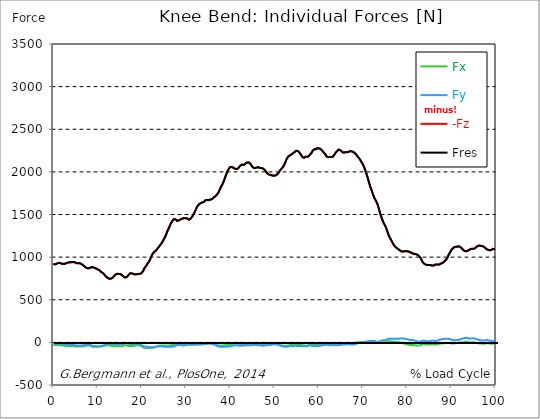
| Category |  Fx |  Fy |  -Fz |  Fres |
|---|---|---|---|---|
| 0.0 | -29.6 | -11.51 | 920.39 | 921.09 |
| 0.167348456675344 | -29.86 | -11.63 | 915.72 | 916.42 |
| 0.334696913350688 | -30.33 | -12.52 | 914.68 | 915.38 |
| 0.5020453700260321 | -30.87 | -13.44 | 916.3 | 917.03 |
| 0.669393826701376 | -31.92 | -15.22 | 919.17 | 920 |
| 0.83674228337672 | -32.69 | -15.88 | 925.15 | 926.02 |
| 1.0040907400520642 | -32.63 | -15.28 | 928.49 | 929.38 |
| 1.1621420602454444 | -33.1 | -15.46 | 931.57 | 932.5 |
| 1.3294905169207885 | -34.34 | -17.1 | 933.19 | 934.24 |
| 1.4968389735961325 | -33.93 | -16.55 | 931.96 | 932.98 |
| 1.6641874302714765 | -33.9 | -16.96 | 927.29 | 928.27 |
| 1.8315358869468206 | -35.71 | -19.66 | 921.16 | 922.18 |
| 1.9988843436221646 | -36.73 | -21.49 | 919.78 | 920.84 |
| 2.1662328002975086 | -37.03 | -21.67 | 919.46 | 920.54 |
| 2.333581256972853 | -37.73 | -22.18 | 920.14 | 921.26 |
| 2.5009297136481967 | -38.57 | -22.88 | 921.05 | 922.22 |
| 2.6682781703235405 | -39.08 | -23.29 | 922.71 | 923.9 |
| 2.8356266269988843 | -40.06 | -24.19 | 924.94 | 926.21 |
| 3.002975083674229 | -41.01 | -25 | 929.22 | 930.53 |
| 3.1703235403495724 | -41.32 | -25.15 | 932.81 | 934.14 |
| 3.337671997024917 | -41.63 | -25.3 | 936.4 | 937.75 |
| 3.4957233172182973 | -42.59 | -26.61 | 938.2 | 939.61 |
| 3.663071773893641 | -43.16 | -27.22 | 938.02 | 939.47 |
| 3.8304202305689854 | -43.08 | -26.8 | 937.91 | 939.34 |
| 3.997768687244329 | -43.61 | -27.53 | 938.73 | 940.22 |
| 4.165117143919673 | -44.58 | -28.84 | 940.03 | 941.62 |
| 4.332465600595017 | -45.62 | -30.15 | 941.02 | 942.73 |
| 4.499814057270361 | -46.16 | -31.24 | 941.23 | 943.02 |
| 4.667162513945706 | -46.46 | -32.11 | 940.82 | 942.66 |
| 4.834510970621049 | -46.57 | -32.76 | 938.33 | 940.16 |
| 5.001859427296393 | -47.49 | -34.1 | 934.45 | 936.35 |
| 5.169207883971737 | -48.42 | -35.43 | 930.56 | 932.54 |
| 5.336556340647081 | -49.16 | -36.52 | 927.31 | 929.36 |
| 5.503904797322425 | -48.64 | -36.14 | 927.49 | 929.49 |
| 5.671253253997769 | -48 | -35.77 | 927.72 | 929.68 |
| 5.82930457419115 | -47.94 | -35.78 | 928.34 | 930.28 |
| 5.996653030866494 | -48.32 | -36.75 | 926.7 | 928.7 |
| 6.164001487541838 | -48.49 | -37.44 | 924.11 | 926.15 |
| 6.331349944217181 | -48.01 | -37.28 | 918.09 | 920.11 |
| 6.498698400892526 | -46.69 | -34.7 | 913.93 | 915.78 |
| 6.66604685756787 | -45.64 | -33.03 | 906.58 | 908.33 |
| 6.833395314243213 | -44.74 | -31.99 | 898.5 | 900.18 |
| 7.000743770918558 | -44.34 | -32.43 | 890.57 | 892.28 |
| 7.168092227593902 | -42.76 | -31.74 | 883.73 | 885.35 |
| 7.335440684269246 | -40.46 | -30.37 | 877.53 | 879.02 |
| 7.50278914094459 | -38.16 | -28.99 | 871.33 | 872.69 |
| 7.6701375976199335 | -35.48 | -27.53 | 868.53 | 869.76 |
| 7.837486054295278 | -34.72 | -26.75 | 869.11 | 870.34 |
| 7.995537374488658 | -35.27 | -28.09 | 869.01 | 870.35 |
| 8.162885831164003 | -36.16 | -28.33 | 870.44 | 871.87 |
| 8.330234287839346 | -37.38 | -28.66 | 872.74 | 874.26 |
| 8.49758274451469 | -42.42 | -33.16 | 879.26 | 881.08 |
| 8.664931201190035 | -47.8 | -37.67 | 883.02 | 885.16 |
| 8.832279657865378 | -50.67 | -39.99 | 881.62 | 884.02 |
| 8.999628114540721 | -51.43 | -40.34 | 878.9 | 881.38 |
| 9.166976571216066 | -52.51 | -41.39 | 875.75 | 878.35 |
| 9.334325027891412 | -53.77 | -43.29 | 872.15 | 874.94 |
| 9.501673484566755 | -52.86 | -43.46 | 868 | 870.75 |
| 9.669021941242098 | -52.33 | -44.81 | 865.1 | 867.89 |
| 9.836370397917442 | -52.55 | -46.55 | 861.79 | 864.71 |
| 10.003718854592787 | -51.9 | -46.41 | 854.38 | 857.29 |
| 10.17106731126813 | -50.65 | -45.52 | 850.39 | 853.19 |
| 10.329118631461512 | -49.57 | -44.95 | 848.11 | 850.82 |
| 10.496467088136853 | -49.31 | -44.72 | 840.46 | 843.18 |
| 10.663815544812199 | -48.68 | -43.2 | 829.64 | 832.28 |
| 10.831164001487544 | -48.29 | -41.49 | 819.55 | 822.11 |
| 10.998512458162887 | -47.46 | -40.37 | 817.77 | 820.23 |
| 11.16586091483823 | -45.4 | -38.01 | 813.75 | 816 |
| 11.333209371513574 | -42.5 | -34.6 | 806.28 | 808.26 |
| 11.50055782818892 | -39.16 | -30.52 | 795.48 | 797.17 |
| 11.667906284864264 | -37.33 | -27.38 | 784.45 | 785.99 |
| 11.835254741539607 | -36.13 | -24.94 | 774.51 | 775.93 |
| 12.00260319821495 | -35.88 | -23.2 | 766.22 | 767.56 |
| 12.169951654890292 | -35.64 | -21.07 | 760.16 | 761.41 |
| 12.337300111565641 | -34.73 | -18.58 | 755.38 | 756.53 |
| 12.504648568240984 | -34.28 | -16.94 | 750.52 | 751.62 |
| 12.662699888434362 | -35.39 | -16.76 | 744.77 | 745.9 |
| 12.830048345109708 | -37.53 | -17.11 | 743.9 | 745.11 |
| 12.997396801785053 | -40.3 | -18.28 | 746.57 | 747.94 |
| 13.164745258460396 | -42.74 | -18.81 | 749.53 | 751.01 |
| 13.33209371513574 | -42.55 | -18.85 | 754.73 | 756.17 |
| 13.499442171811083 | -43.87 | -19.52 | 762.56 | 764.08 |
| 13.666790628486426 | -45.66 | -21.03 | 773.2 | 774.84 |
| 13.834139085161771 | -46.95 | -22.02 | 784.34 | 786.06 |
| 14.001487541837117 | -46.43 | -22.55 | 792.73 | 794.42 |
| 14.16883599851246 | -45.58 | -22.04 | 798.1 | 799.71 |
| 14.336184455187803 | -44.4 | -21.54 | 801.89 | 803.41 |
| 14.503532911863147 | -44.03 | -21.27 | 803.74 | 805.24 |
| 14.670881368538492 | -43.7 | -20.94 | 803.59 | 805.06 |
| 14.828932688731873 | -43.55 | -20.84 | 801.99 | 803.46 |
| 14.996281145407215 | -44.41 | -21.9 | 800.26 | 801.81 |
| 15.163629602082558 | -45.67 | -22.87 | 797.91 | 799.58 |
| 15.330978058757903 | -46.89 | -23.71 | 795.24 | 797.03 |
| 15.498326515433247 | -46.03 | -22.47 | 788.77 | 790.47 |
| 15.665674972108594 | -43.74 | -20.25 | 780.63 | 782.15 |
| 15.833023428783937 | -40.45 | -17.39 | 771.09 | 772.36 |
| 16.00037188545928 | -36.11 | -13.85 | 765.36 | 766.46 |
| 16.167720342134626 | -32.44 | -10.69 | 760.87 | 761.85 |
| 16.335068798809967 | -33.49 | -10.38 | 760.96 | 762.07 |
| 16.502417255485312 | -35.17 | -10.41 | 762.32 | 763.57 |
| 16.669765712160658 | -38.21 | -12.4 | 768.3 | 769.74 |
| 16.837114168836 | -41.49 | -15.13 | 778.02 | 779.74 |
| 17.004462625511344 | -43.08 | -16.89 | 789.11 | 790.98 |
| 17.16251394570472 | -43.84 | -18.07 | 800.45 | 802.39 |
| 17.32986240238007 | -43.35 | -18.12 | 807.63 | 809.47 |
| 17.497210859055414 | -42.3 | -17.57 | 810.36 | 811.99 |
| 17.664559315730756 | -42.6 | -18.29 | 810.24 | 811.79 |
| 17.8319077724061 | -43.16 | -19.32 | 808.1 | 809.63 |
| 17.999256229081443 | -43.04 | -19.41 | 803.05 | 804.56 |
| 18.166604685756788 | -41.94 | -18.9 | 798.83 | 800.3 |
| 18.333953142432133 | -40.8 | -18.94 | 797.31 | 798.71 |
| 18.501301599107478 | -37.9 | -17.93 | 796.75 | 798.05 |
| 18.668650055782823 | -35.26 | -16.97 | 796.23 | 797.5 |
| 18.835998512458165 | -32.87 | -16.13 | 796.87 | 798.12 |
| 19.00334696913351 | -33.11 | -17.08 | 800.18 | 801.42 |
| 19.170695425808855 | -34.25 | -18.61 | 802.83 | 804.07 |
| 19.338043882484197 | -35.45 | -20.51 | 802.36 | 803.65 |
| 19.496095202677576 | -36.98 | -23.09 | 802.03 | 803.39 |
| 19.66344365935292 | -39.53 | -25.41 | 803.21 | 804.72 |
| 19.830792116028263 | -43.31 | -29.27 | 808.82 | 810.62 |
| 19.998140572703612 | -48.04 | -33.35 | 815.28 | 817.44 |
| 20.165489029378953 | -52.74 | -37.77 | 825.2 | 827.82 |
| 20.3328374860543 | -58.09 | -42.98 | 838.89 | 842.08 |
| 20.500185942729644 | -63.24 | -48.02 | 856.44 | 860.24 |
| 20.667534399404985 | -65.29 | -50.26 | 873.62 | 877.64 |
| 20.83488285608033 | -64.54 | -49.6 | 884.16 | 888.04 |
| 21.002231312755672 | -65.47 | -51.34 | 896.21 | 900.21 |
| 21.16957976943102 | -66.18 | -52.79 | 909.7 | 913.79 |
| 21.336928226106362 | -65.36 | -52.5 | 923.86 | 927.81 |
| 21.504276682781704 | -64.09 | -51.93 | 934.5 | 938.28 |
| 21.67162513945705 | -64.22 | -53.04 | 947.59 | 951.4 |
| 21.82967645965043 | -64.83 | -55 | 965.49 | 969.39 |
| 21.997024916325774 | -65.22 | -57.06 | 986.82 | 990.78 |
| 22.16437337300112 | -64.61 | -58.27 | 1007.57 | 1011.47 |
| 22.33172182967646 | -62.94 | -58.69 | 1024.87 | 1028.62 |
| 22.499070286351806 | -61.05 | -58.86 | 1041.22 | 1044.81 |
| 22.666418743027148 | -58.55 | -57.57 | 1052.1 | 1055.45 |
| 22.833767199702496 | -55.34 | -56.13 | 1060.36 | 1063.39 |
| 23.00111565637784 | -52.32 | -53.55 | 1065.95 | 1068.66 |
| 23.168464113053183 | -49.63 | -51.13 | 1072.96 | 1075.4 |
| 23.335812569728528 | -47.42 | -49.63 | 1084.54 | 1086.79 |
| 23.50316102640387 | -44.89 | -48.33 | 1096.78 | 1098.84 |
| 23.670509483079215 | -42.32 | -47.55 | 1107.11 | 1109.01 |
| 23.83785793975456 | -40.55 | -47.1 | 1118.29 | 1120.11 |
| 23.995909259947936 | -37.89 | -45.49 | 1130.19 | 1131.89 |
| 24.163257716623285 | -36 | -44.75 | 1141.25 | 1142.86 |
| 24.330606173298627 | -35.78 | -45.83 | 1152.1 | 1153.73 |
| 24.49795462997397 | -36.03 | -47.31 | 1165.18 | 1166.88 |
| 24.665303086649313 | -36.29 | -48.79 | 1178.36 | 1180.13 |
| 24.83265154332466 | -36.76 | -50.52 | 1194.33 | 1196.18 |
| 25.0 | -36.59 | -51.01 | 1209.28 | 1211.15 |
| 25.167348456675345 | -36.57 | -50.94 | 1225.3 | 1227.16 |
| 25.334696913350694 | -36.8 | -49.89 | 1243.2 | 1245.02 |
| 25.502045370026035 | -37.88 | -50.1 | 1264.51 | 1266.31 |
| 25.669393826701377 | -38.68 | -50.99 | 1287.17 | 1288.95 |
| 25.836742283376722 | -38.24 | -50.99 | 1309.2 | 1310.9 |
| 26.004090740052067 | -37.12 | -50.98 | 1326.26 | 1327.97 |
| 26.17143919672741 | -35.77 | -51.31 | 1344.73 | 1346.43 |
| 26.329490516920792 | -35.44 | -52.6 | 1367.64 | 1369.36 |
| 26.49683897359613 | -34.44 | -53.25 | 1387.86 | 1389.56 |
| 26.66418743027148 | -32.24 | -52.45 | 1402.54 | 1404.14 |
| 26.831535886946828 | -30.42 | -51.37 | 1417.19 | 1418.69 |
| 26.998884343622166 | -28.6 | -50.29 | 1431.84 | 1433.25 |
| 27.166232800297514 | -26.65 | -49.77 | 1441.96 | 1443.32 |
| 27.333581256972852 | -24.14 | -47.78 | 1446.44 | 1447.69 |
| 27.5009297136482 | -21.81 | -43.4 | 1446.8 | 1447.92 |
| 27.668278170323543 | -20.57 | -38.21 | 1441.13 | 1442.15 |
| 27.835626626998888 | -20.11 | -34.62 | 1431.57 | 1432.57 |
| 28.002975083674233 | -20.04 | -31.72 | 1422.88 | 1423.86 |
| 28.170323540349575 | -21.09 | -31.96 | 1426.31 | 1427.3 |
| 28.33767199702492 | -21.3 | -30.96 | 1430.09 | 1431.08 |
| 28.50502045370026 | -22.06 | -30.56 | 1434.39 | 1435.39 |
| 28.663071773893645 | -23.07 | -30.52 | 1438.99 | 1440 |
| 28.830420230568986 | -23.66 | -30.86 | 1443.13 | 1444.18 |
| 28.99776868724433 | -25.26 | -33.04 | 1447.11 | 1448.23 |
| 29.165117143919673 | -27.64 | -35.78 | 1451.36 | 1452.54 |
| 29.33246560059502 | -29.17 | -37.18 | 1455.55 | 1456.78 |
| 29.499814057270367 | -29.34 | -36.35 | 1455.73 | 1456.95 |
| 29.66716251394571 | -29.39 | -34.62 | 1456.59 | 1457.82 |
| 29.834510970621054 | -29.43 | -32.85 | 1457.53 | 1458.77 |
| 30.00185942729639 | -28.13 | -29.37 | 1455.18 | 1456.4 |
| 30.169207883971744 | -26.94 | -25.33 | 1452.05 | 1453.26 |
| 30.33655634064708 | -26.61 | -22.98 | 1450.82 | 1452.04 |
| 30.50390479732243 | -26.49 | -22.01 | 1440.96 | 1442.19 |
| 30.671253253997772 | -26.54 | -21.95 | 1438.46 | 1439.68 |
| 30.829304574191156 | -27.36 | -22.46 | 1442.04 | 1443.33 |
| 30.996653030866494 | -27.92 | -22.53 | 1448.88 | 1450.24 |
| 31.164001487541842 | -28.38 | -23.2 | 1458.31 | 1459.75 |
| 31.331349944217187 | -28.89 | -24.88 | 1469.95 | 1471.46 |
| 31.498698400892525 | -29.18 | -26.94 | 1483.31 | 1484.85 |
| 31.666046857567874 | -28.73 | -27.18 | 1500.3 | 1501.76 |
| 31.833395314243212 | -26.96 | -26.52 | 1516.85 | 1518.15 |
| 32.00074377091856 | -24.28 | -25.16 | 1534.18 | 1535.29 |
| 32.1680922275939 | -21.6 | -23.81 | 1551.51 | 1552.43 |
| 32.33544068426925 | -21.91 | -23.85 | 1572.68 | 1573.53 |
| 32.50278914094459 | -21.92 | -23.3 | 1590.65 | 1591.4 |
| 32.670137597619934 | -21.65 | -23.17 | 1603.69 | 1604.37 |
| 32.83748605429528 | -21.54 | -23.4 | 1613.97 | 1614.6 |
| 33.004834510970625 | -22.03 | -24.29 | 1622.29 | 1622.9 |
| 33.162885831164004 | -21.36 | -24.62 | 1628.9 | 1629.47 |
| 33.33023428783935 | -19.55 | -24.28 | 1633.23 | 1633.75 |
| 33.497582744514695 | -17.97 | -23.91 | 1636.43 | 1636.91 |
| 33.664931201190036 | -17.89 | -23.26 | 1641.58 | 1642.05 |
| 33.83227965786538 | -16.9 | -22.26 | 1643.93 | 1644.39 |
| 33.99962811454073 | -15.87 | -21.19 | 1646.53 | 1646.97 |
| 34.16697657121607 | -15.96 | -20.2 | 1655.15 | 1655.59 |
| 34.33432502789141 | -16.03 | -18.81 | 1664.46 | 1664.89 |
| 34.50167348456676 | -15.96 | -16.79 | 1671.06 | 1671.48 |
| 34.6690219412421 | -15.48 | -14.35 | 1670.85 | 1671.27 |
| 34.83637039791744 | -14.26 | -12.03 | 1668.61 | 1669.03 |
| 35.00371885459279 | -14.02 | -12.04 | 1666.75 | 1667.16 |
| 35.17106731126814 | -14.3 | -12.85 | 1668.21 | 1668.61 |
| 35.338415767943474 | -14.89 | -13.82 | 1673.75 | 1674.14 |
| 35.49646708813686 | -15.26 | -14.16 | 1676.85 | 1677.24 |
| 35.6638155448122 | -15.46 | -14.92 | 1675.04 | 1675.43 |
| 35.831164001487544 | -16.11 | -16.75 | 1675.97 | 1676.35 |
| 35.998512458162885 | -17.71 | -19.4 | 1684.56 | 1684.96 |
| 36.165860914838234 | -19.41 | -21.69 | 1694.73 | 1695.15 |
| 36.333209371513576 | -21.33 | -24.56 | 1704.55 | 1705.03 |
| 36.50055782818892 | -23.34 | -28.35 | 1708.2 | 1708.78 |
| 36.667906284864266 | -25.61 | -32.59 | 1713.56 | 1714.26 |
| 36.83525474153961 | -28.66 | -37.42 | 1723.64 | 1724.55 |
| 37.002603198214956 | -31.82 | -41.98 | 1734.07 | 1735.22 |
| 37.1699516548903 | -33.87 | -44.9 | 1744.02 | 1745.31 |
| 37.337300111565646 | -34.99 | -46.45 | 1758.24 | 1759.59 |
| 37.50464856824098 | -35.73 | -48.48 | 1775.29 | 1776.65 |
| 37.66269988843437 | -36.94 | -50.36 | 1795.14 | 1796.52 |
| 37.83004834510971 | -38.47 | -52.34 | 1815.65 | 1817.07 |
| 37.99739680178505 | -39.37 | -53.8 | 1833.46 | 1834.92 |
| 38.16474525846039 | -38.79 | -53.32 | 1848.19 | 1849.63 |
| 38.33209371513574 | -36.82 | -50.76 | 1865.54 | 1866.89 |
| 38.49944217181109 | -34.67 | -48.92 | 1886.33 | 1887.57 |
| 38.666790628486424 | -33.55 | -49.16 | 1910.32 | 1911.52 |
| 38.83413908516178 | -34.76 | -51.98 | 1934.92 | 1936.16 |
| 39.001487541837115 | -33.27 | -51.69 | 1957.87 | 1959.08 |
| 39.16883599851246 | -32.01 | -51.44 | 1981.8 | 1982.97 |
| 39.336184455187805 | -30.37 | -50.6 | 2002.9 | 2004.03 |
| 39.503532911863154 | -27.91 | -48.47 | 2020.46 | 2021.46 |
| 39.670881368538495 | -25.53 | -47.01 | 2033.96 | 2034.9 |
| 39.83822982521384 | -24.96 | -47.23 | 2047.93 | 2048.84 |
| 39.996281145407224 | -23.73 | -45.72 | 2056.2 | 2057.02 |
| 40.163629602082565 | -21.24 | -43.23 | 2057.98 | 2058.68 |
| 40.33097805875791 | -19.38 | -41.4 | 2057.79 | 2058.43 |
| 40.498326515433256 | -17.56 | -39.06 | 2053.76 | 2054.34 |
| 40.6656749721086 | -16.57 | -37.44 | 2047.23 | 2047.79 |
| 40.83302342878393 | -15.27 | -36.5 | 2043.3 | 2043.85 |
| 41.00037188545929 | -13.76 | -35.79 | 2041.16 | 2041.69 |
| 41.16772034213463 | -11.81 | -33.79 | 2035.22 | 2035.72 |
| 41.33506879880997 | -10.03 | -31.92 | 2030.46 | 2030.93 |
| 41.50241725548531 | -10.48 | -32.47 | 2031.31 | 2031.8 |
| 41.66976571216066 | -13.05 | -35.62 | 2036.59 | 2037.18 |
| 41.837114168836 | -14.56 | -37.27 | 2045.03 | 2045.66 |
| 42.004462625511344 | -16.87 | -39.7 | 2056.43 | 2057.15 |
| 42.17181108218669 | -18.02 | -39.89 | 2067.21 | 2067.93 |
| 42.32986240238007 | -18.44 | -39.37 | 2076 | 2076.7 |
| 42.497210859055414 | -18.93 | -39.05 | 2081.66 | 2082.33 |
| 42.66455931573076 | -18.55 | -37.68 | 2083.37 | 2083.97 |
| 42.831907772406105 | -17.9 | -36.23 | 2083.28 | 2083.82 |
| 42.999256229081446 | -17.82 | -35.72 | 2082.6 | 2083.11 |
| 43.16660468575679 | -18.07 | -35.46 | 2083.85 | 2084.34 |
| 43.33395314243214 | -19.2 | -36 | 2090.29 | 2090.8 |
| 43.50130159910748 | -19 | -35.21 | 2099.52 | 2100.02 |
| 43.66865005578282 | -18.97 | -33.83 | 2106.38 | 2106.87 |
| 43.83599851245817 | -18.63 | -33.18 | 2109.43 | 2109.96 |
| 44.00334696913351 | -18.89 | -32.86 | 2110.21 | 2110.75 |
| 44.17069542580886 | -21.26 | -34.89 | 2110.88 | 2111.46 |
| 44.3380438824842 | -23.08 | -35.74 | 2107.3 | 2107.89 |
| 44.49609520267758 | -22.97 | -35.17 | 2097.54 | 2098.12 |
| 44.66344365935292 | -22.37 | -33.84 | 2086.09 | 2086.64 |
| 44.83079211602827 | -21.88 | -32.11 | 2072.44 | 2072.96 |
| 44.99814057270361 | -21.37 | -30.37 | 2058.83 | 2059.32 |
| 45.16548902937895 | -21.43 | -29.62 | 2050.65 | 2051.15 |
| 45.332837486054295 | -20.97 | -28.83 | 2045.52 | 2046.01 |
| 45.500185942729644 | -20.81 | -28.93 | 2043.29 | 2043.79 |
| 45.66753439940499 | -21.83 | -30.21 | 2044.68 | 2045.24 |
| 45.83488285608033 | -23.17 | -31.96 | 2048.02 | 2048.63 |
| 46.00223131275568 | -23.51 | -32.66 | 2051.6 | 2052.21 |
| 46.16957976943102 | -25.28 | -34.76 | 2056.39 | 2057.01 |
| 46.336928226106366 | -25.3 | -34.96 | 2054.92 | 2055.53 |
| 46.50427668278171 | -26.95 | -35.66 | 2051 | 2051.62 |
| 46.671625139457056 | -25.82 | -33.08 | 2045.92 | 2046.5 |
| 46.829676459650436 | -26.11 | -32.87 | 2043.73 | 2044.31 |
| 46.99702491632577 | -29.58 | -36.84 | 2045.42 | 2046.11 |
| 47.16437337300112 | -31.71 | -39.57 | 2045.05 | 2045.82 |
| 47.33172182967646 | -31.48 | -39.58 | 2040.27 | 2041.04 |
| 47.49907028635181 | -31.64 | -39.35 | 2034.93 | 2035.69 |
| 47.66641874302716 | -31.95 | -38.97 | 2028.66 | 2029.42 |
| 47.83376719970249 | -30.16 | -36.08 | 2019.22 | 2019.91 |
| 48.001115656377834 | -29.2 | -34.81 | 2007.66 | 2008.32 |
| 48.16846411305319 | -29.51 | -35.22 | 1995.45 | 1996.14 |
| 48.33581256972853 | -29.35 | -34.7 | 1984 | 1984.69 |
| 48.50316102640387 | -28 | -31.33 | 1975.25 | 1975.91 |
| 48.67050948307921 | -25.99 | -28.88 | 1969.81 | 1970.44 |
| 48.837857939754564 | -27.08 | -30.36 | 1967.14 | 1967.84 |
| 49.005206396429905 | -26.91 | -30.32 | 1965.69 | 1966.39 |
| 49.163257716623285 | -26.43 | -29.83 | 1963.85 | 1964.54 |
| 49.33060617329863 | -24.62 | -27.32 | 1960.31 | 1960.93 |
| 49.49795462997397 | -22.81 | -24.81 | 1956.77 | 1957.33 |
| 49.66530308664932 | -21.24 | -23.01 | 1954.34 | 1954.82 |
| 49.832651543324666 | -21.34 | -22.5 | 1955.08 | 1955.56 |
| 50.0 | -22.12 | -22.27 | 1955.85 | 1956.33 |
| 50.16734845667534 | -22.28 | -21.92 | 1956.93 | 1957.4 |
| 50.33469691335069 | -21.77 | -21.74 | 1959.49 | 1959.96 |
| 50.50204537002604 | -23.68 | -24.59 | 1966.54 | 1967.08 |
| 50.66939382670139 | -24.72 | -25.46 | 1974.08 | 1974.62 |
| 50.836742283376715 | -25.74 | -26.48 | 1982.44 | 1982.99 |
| 51.00409074005207 | -29.13 | -31.4 | 1995.96 | 1996.59 |
| 51.17143919672741 | -32.36 | -36.21 | 2009.84 | 2010.54 |
| 51.32949051692079 | -34.03 | -39.04 | 2021.2 | 2021.95 |
| 51.496838973596134 | -35.5 | -41.86 | 2031.87 | 2032.69 |
| 51.66418743027148 | -36.39 | -44.42 | 2041.72 | 2042.58 |
| 51.831535886946824 | -37.55 | -46.68 | 2051.85 | 2052.77 |
| 51.99888434362217 | -38.17 | -48.05 | 2064.17 | 2065.15 |
| 52.16623280029752 | -37.56 | -47.82 | 2078.1 | 2079.09 |
| 52.33358125697285 | -38.22 | -49.44 | 2095.77 | 2096.82 |
| 52.5009297136482 | -39.48 | -51.14 | 2119.31 | 2120.4 |
| 52.668278170323546 | -39.59 | -51.23 | 2141.69 | 2142.77 |
| 52.835626626998895 | -38.74 | -50.49 | 2157.19 | 2158.24 |
| 53.00297508367424 | -37.01 | -49.24 | 2170.66 | 2171.67 |
| 53.17032354034958 | -35.64 | -48.36 | 2182.49 | 2183.48 |
| 53.33767199702492 | -33.73 | -46.31 | 2189.23 | 2190.14 |
| 53.50502045370027 | -31.74 | -44.56 | 2192.34 | 2193.15 |
| 53.663071773893655 | -30.17 | -43.29 | 2196 | 2196.74 |
| 53.83042023056899 | -29.81 | -42.69 | 2204.27 | 2204.99 |
| 53.99776868724433 | -31.2 | -44.25 | 2213.58 | 2214.37 |
| 54.16511714391967 | -30.84 | -44.16 | 2220.08 | 2220.89 |
| 54.33246560059503 | -30.24 | -43.78 | 2225.96 | 2226.8 |
| 54.49981405727037 | -28.92 | -42.31 | 2230.08 | 2230.89 |
| 54.667162513945705 | -26.87 | -39.51 | 2237.64 | 2238.34 |
| 54.834510970621054 | -28.2 | -41.24 | 2245.88 | 2246.65 |
| 55.0018594272964 | -29.62 | -42.78 | 2250.08 | 2250.94 |
| 55.169207883971744 | -29.81 | -42.27 | 2246.22 | 2247.09 |
| 55.336556340647086 | -29.8 | -41.54 | 2241.36 | 2242.2 |
| 55.50390479732243 | -29.79 | -41.14 | 2234.39 | 2235.21 |
| 55.671253253997776 | -29.79 | -41.33 | 2223.85 | 2224.68 |
| 55.83860171067312 | -30.01 | -41.75 | 2212.07 | 2212.9 |
| 55.9966530308665 | -29.51 | -41.29 | 2198.47 | 2199.28 |
| 56.16400148754184 | -30.75 | -41.88 | 2186.2 | 2187 |
| 56.33134994421718 | -33.14 | -42.3 | 2173.49 | 2174.28 |
| 56.498698400892536 | -34.34 | -42.07 | 2164.3 | 2165.06 |
| 56.66604685756788 | -34.02 | -41.83 | 2164.69 | 2165.43 |
| 56.83339531424321 | -36.1 | -44.52 | 2170.93 | 2171.75 |
| 57.00074377091856 | -38.88 | -46.72 | 2176.41 | 2177.32 |
| 57.16809222759391 | -39.59 | -46.64 | 2178.04 | 2178.95 |
| 57.33544068426925 | -38.07 | -43.88 | 2177.57 | 2178.39 |
| 57.5027891409446 | -35.47 | -39.76 | 2175.5 | 2176.18 |
| 57.670137597619934 | -32.08 | -35.66 | 2180.74 | 2181.28 |
| 57.83748605429528 | -32.69 | -36.26 | 2190.44 | 2191 |
| 58.004834510970625 | -33.73 | -37.84 | 2200.69 | 2201.29 |
| 58.16288583116401 | -32.29 | -36.99 | 2209.26 | 2209.82 |
| 58.330234287839346 | -30.51 | -36.43 | 2220.03 | 2220.55 |
| 58.497582744514695 | -29.59 | -37.85 | 2234.3 | 2234.83 |
| 58.66493120119004 | -31.34 | -41.78 | 2250.36 | 2250.98 |
| 58.832279657865385 | -32.27 | -44.09 | 2261.06 | 2261.72 |
| 58.999628114540734 | -32.4 | -44.89 | 2263.59 | 2264.29 |
| 59.16697657121607 | -30.75 | -43.57 | 2264.68 | 2265.32 |
| 59.33432502789142 | -28.8 | -41.99 | 2265.66 | 2266.24 |
| 59.50167348456676 | -28.21 | -42.19 | 2272.57 | 2273.15 |
| 59.66902194124211 | -29.13 | -43.94 | 2279.75 | 2280.38 |
| 59.83637039791745 | -28.94 | -43.32 | 2279.06 | 2279.68 |
| 60.00371885459278 | -27.35 | -41.01 | 2274.25 | 2274.82 |
| 60.17106731126813 | -25.47 | -39.95 | 2269.8 | 2270.32 |
| 60.33841576794349 | -24.9 | -40.17 | 2271 | 2271.53 |
| 60.49646708813685 | -24.28 | -39.57 | 2268.35 | 2268.88 |
| 60.6638155448122 | -22.58 | -36.33 | 2255.18 | 2255.65 |
| 60.831164001487544 | -20.99 | -33.95 | 2244.2 | 2244.59 |
| 60.99851245816289 | -20.9 | -32.85 | 2235.21 | 2235.57 |
| 61.16586091483824 | -21.65 | -32.27 | 2226.71 | 2227.07 |
| 61.333209371513576 | -20.78 | -29.82 | 2216.88 | 2217.19 |
| 61.50055782818892 | -19.74 | -27.35 | 2207.67 | 2207.93 |
| 61.667906284864266 | -20.31 | -26.56 | 2192.34 | 2192.6 |
| 61.835254741539615 | -22.05 | -27.58 | 2178.24 | 2178.54 |
| 62.002603198214956 | -24.9 | -30.59 | 2173.21 | 2173.58 |
| 62.16995165489029 | -25.99 | -31.87 | 2172.04 | 2172.45 |
| 62.33730011156564 | -27.61 | -33.81 | 2173.51 | 2173.97 |
| 62.504648568240995 | -27.52 | -34.41 | 2174.91 | 2175.39 |
| 62.67199702491633 | -26.42 | -32.56 | 2174.18 | 2174.62 |
| 62.83004834510971 | -25.3 | -30.66 | 2173.43 | 2173.83 |
| 62.99739680178505 | -24.26 | -29.12 | 2173.94 | 2174.3 |
| 63.1647452584604 | -23.35 | -28.39 | 2177.33 | 2177.67 |
| 63.33209371513575 | -25.21 | -30.81 | 2186.71 | 2187.12 |
| 63.4994421718111 | -27.14 | -33.3 | 2199.54 | 2200.01 |
| 63.666790628486424 | -28.5 | -35.28 | 2212.71 | 2213.22 |
| 63.83413908516177 | -28.15 | -35.61 | 2226.15 | 2226.66 |
| 64.00148754183712 | -26.82 | -34.01 | 2237.48 | 2237.94 |
| 64.16883599851248 | -24.41 | -31.53 | 2244.5 | 2244.89 |
| 64.3361844551878 | -23.14 | -29.62 | 2252.95 | 2253.3 |
| 64.50353291186315 | -24.85 | -31.26 | 2261.6 | 2261.98 |
| 64.6708813685385 | -25.18 | -31.34 | 2262.99 | 2263.39 |
| 64.83822982521384 | -21.77 | -27.02 | 2256.18 | 2256.47 |
| 65.00557828188919 | -21.23 | -26.71 | 2248.55 | 2248.83 |
| 65.16362960208257 | -21.48 | -27.81 | 2240.76 | 2241.05 |
| 65.3309780587579 | -19.97 | -26.43 | 2232.73 | 2232.99 |
| 65.49832651543326 | -18.12 | -24.55 | 2227.29 | 2227.51 |
| 65.6656749721086 | -16.92 | -23.56 | 2226.61 | 2226.81 |
| 65.83302342878395 | -16.25 | -23.15 | 2226.63 | 2226.83 |
| 66.00037188545929 | -17.24 | -24.14 | 2229.95 | 2230.16 |
| 66.16772034213463 | -18.29 | -24.8 | 2232.7 | 2232.94 |
| 66.33506879880998 | -16.67 | -22.83 | 2229.88 | 2230.08 |
| 66.50241725548531 | -15.63 | -21.97 | 2229.85 | 2230.03 |
| 66.66976571216065 | -15.16 | -22.09 | 2231.99 | 2232.19 |
| 66.83711416883601 | -15.08 | -23.63 | 2237.65 | 2237.85 |
| 67.00446262551135 | -14.25 | -24.63 | 2242.42 | 2242.62 |
| 67.1718110821867 | -13.71 | -25.52 | 2243.07 | 2243.29 |
| 67.32986240238007 | -11.16 | -24.2 | 2239.52 | 2239.7 |
| 67.49721085905541 | -11.07 | -25.96 | 2239.14 | 2239.35 |
| 67.66455931573076 | -10.3 | -26.68 | 2236.46 | 2236.68 |
| 67.83190777240611 | -9.34 | -27.01 | 2233.23 | 2233.46 |
| 67.99925622908145 | -7.18 | -24.69 | 2226.39 | 2226.59 |
| 68.16660468575678 | -5.97 | -22.67 | 2220.39 | 2220.56 |
| 68.33395314243214 | -4.32 | -19.96 | 2211.97 | 2212.13 |
| 68.50130159910749 | -1.68 | -16.2 | 2199.98 | 2200.14 |
| 68.66865005578282 | 0.41 | -12.4 | 2188.35 | 2188.52 |
| 68.83599851245816 | 0.98 | -11.13 | 2177.84 | 2178.02 |
| 69.00334696913352 | 2.23 | -8.98 | 2167.64 | 2167.83 |
| 69.17069542580886 | 3.47 | -6.83 | 2157.44 | 2157.64 |
| 69.3380438824842 | 3.55 | -6.52 | 2145 | 2145.23 |
| 69.50539233915956 | 4.1 | -5.1 | 2130.01 | 2130.27 |
| 69.66344365935292 | 5.78 | -1.47 | 2114.93 | 2115.28 |
| 69.83079211602826 | 7.69 | 2.6 | 2099.94 | 2100.39 |
| 69.99814057270362 | 5.52 | 0.26 | 2086.07 | 2086.53 |
| 70.16548902937896 | 4.79 | -0.55 | 2068.18 | 2068.66 |
| 70.33283748605429 | 5.87 | 1.04 | 2046.27 | 2046.75 |
| 70.50018594272964 | 6.64 | 3.27 | 2020.56 | 2021.08 |
| 70.667534399405 | 7.45 | 5.31 | 1994.65 | 1995.24 |
| 70.83488285608033 | 8.31 | 7.38 | 1968.71 | 1969.36 |
| 71.00223131275568 | 9.26 | 9.37 | 1942.46 | 1943.19 |
| 71.16957976943102 | 10.88 | 11.42 | 1914.33 | 1915.16 |
| 71.33692822610637 | 12.99 | 13.68 | 1882.54 | 1883.39 |
| 71.50427668278171 | 14.38 | 15.35 | 1851.71 | 1852.56 |
| 71.67162513945706 | 14.77 | 15.77 | 1824.25 | 1825.08 |
| 71.8389735961324 | 14.62 | 15.43 | 1800.23 | 1801.05 |
| 71.99702491632577 | 14.77 | 15.67 | 1778.5 | 1779.33 |
| 72.16437337300113 | 15.38 | 16.52 | 1750.9 | 1751.7 |
| 72.33172182967647 | 14.58 | 15.69 | 1726.13 | 1726.93 |
| 72.49907028635181 | 13.88 | 14.71 | 1704.46 | 1705.25 |
| 72.66641874302715 | 12.89 | 13.23 | 1683.81 | 1684.58 |
| 72.8337671997025 | 9.24 | 8.66 | 1669.29 | 1669.89 |
| 73.00111565637783 | 4.95 | 4.64 | 1654.31 | 1654.77 |
| 73.16846411305319 | 2.68 | 3.94 | 1634.74 | 1635.25 |
| 73.33581256972853 | 0.96 | 3.55 | 1614.37 | 1614.94 |
| 73.50316102640387 | 0.72 | 4.76 | 1586.33 | 1586.95 |
| 73.67050948307921 | 0.63 | 7.24 | 1556.12 | 1556.77 |
| 73.83785793975457 | 1.27 | 13.5 | 1523.26 | 1523.93 |
| 74.00520639642991 | 1.33 | 17.69 | 1495.68 | 1496.4 |
| 74.16325771662328 | 1.55 | 20.84 | 1468.84 | 1469.6 |
| 74.33060617329863 | 1.46 | 22.66 | 1445.67 | 1446.49 |
| 74.49795462997398 | 1.91 | 24.31 | 1423.09 | 1423.99 |
| 74.66530308664932 | 2.41 | 25.38 | 1401.82 | 1402.76 |
| 74.83265154332466 | 2.81 | 24.99 | 1385 | 1385.93 |
| 75.00000000000001 | 2.84 | 24.82 | 1370.8 | 1371.74 |
| 75.16734845667534 | 5.33 | 27.76 | 1350.74 | 1351.76 |
| 75.3346969133507 | 8.46 | 32.06 | 1327.95 | 1328.97 |
| 75.50204537002605 | 11.02 | 36.43 | 1303.76 | 1304.91 |
| 75.66939382670138 | 12.77 | 39.89 | 1278.99 | 1280.29 |
| 75.83674228337672 | 14.15 | 43.1 | 1254.02 | 1255.36 |
| 76.00409074005208 | 14.15 | 44.42 | 1234.73 | 1236.16 |
| 76.17143919672742 | 12.91 | 43.67 | 1218.6 | 1220 |
| 76.33878765340276 | 11.83 | 43.13 | 1202.57 | 1203.97 |
| 76.49683897359614 | 10.97 | 42.48 | 1187.53 | 1188.9 |
| 76.66418743027148 | 10.32 | 42.55 | 1170.06 | 1171.44 |
| 76.83153588694682 | 9.91 | 44.4 | 1153.07 | 1154.61 |
| 76.99888434362218 | 8.42 | 43.78 | 1140.57 | 1142.13 |
| 77.16623280029752 | 7.17 | 43.9 | 1129.37 | 1130.94 |
| 77.33358125697285 | 6.04 | 44.07 | 1118.71 | 1120.31 |
| 77.5009297136482 | 5.04 | 43.35 | 1111.32 | 1112.94 |
| 77.66827817032356 | 4.01 | 43.14 | 1104.01 | 1105.67 |
| 77.83562662699889 | 2.48 | 43.18 | 1097.53 | 1099.34 |
| 78.00297508367423 | 0.1 | 42.01 | 1092.19 | 1094.18 |
| 78.17032354034959 | -0.15 | 43.28 | 1085.45 | 1087.65 |
| 78.33767199702493 | -0.13 | 45.34 | 1078.31 | 1080.82 |
| 78.50502045370027 | -1.47 | 46.14 | 1071.96 | 1074.7 |
| 78.67236891037561 | -3.53 | 46.16 | 1067.17 | 1070.07 |
| 78.83042023056899 | -6.09 | 46.2 | 1064.28 | 1067.27 |
| 78.99776868724433 | -7.47 | 47.35 | 1063.11 | 1066.19 |
| 79.16511714391969 | -11.09 | 45.32 | 1064.15 | 1067.34 |
| 79.33246560059503 | -13.82 | 43.6 | 1066.68 | 1069.77 |
| 79.49981405727036 | -16.35 | 41.79 | 1068.72 | 1071.65 |
| 79.66716251394571 | -19.27 | 39.35 | 1068.74 | 1071.69 |
| 79.83451097062107 | -21.77 | 37.38 | 1067.87 | 1070.8 |
| 80.00185942729641 | -23.73 | 36.11 | 1066.77 | 1069.63 |
| 80.16920788397174 | -25.36 | 35.19 | 1065.14 | 1067.97 |
| 80.33655634064709 | -26.99 | 34.19 | 1063.45 | 1066.25 |
| 80.50390479732243 | -28.54 | 32.05 | 1060.83 | 1063.5 |
| 80.67125325399778 | -30.52 | 29.65 | 1056.8 | 1059.4 |
| 80.83860171067312 | -31.89 | 28.07 | 1051.54 | 1054.13 |
| 80.99665303086651 | -31.86 | 27.89 | 1047.59 | 1050.18 |
| 81.16400148754184 | -30.46 | 28.75 | 1041.6 | 1044.24 |
| 81.3313499442172 | -30.89 | 27.86 | 1038.26 | 1040.99 |
| 81.49869840089255 | -32.37 | 24.53 | 1037.47 | 1040.03 |
| 81.66604685756786 | -34.35 | 20.6 | 1037.84 | 1040.4 |
| 81.83339531424322 | -34.68 | 18.05 | 1035 | 1037.51 |
| 82.00074377091858 | -34.73 | 15.41 | 1031.91 | 1034.32 |
| 82.16809222759392 | -35.11 | 12.68 | 1028.72 | 1031.03 |
| 82.33544068426926 | -36.93 | 9.76 | 1025.45 | 1027.63 |
| 82.50278914094459 | -37.16 | 7.89 | 1019.5 | 1021.57 |
| 82.67013759761994 | -36.06 | 6.91 | 1011.27 | 1013.25 |
| 82.83748605429528 | -34.3 | 8.43 | 1000.01 | 1001.8 |
| 83.00483451097062 | -32.02 | 10.71 | 990.75 | 992.33 |
| 83.17218296764597 | -28.09 | 13.02 | 977.69 | 978.97 |
| 83.33023428783935 | -23.19 | 17.44 | 958.55 | 959.53 |
| 83.4975827445147 | -20.42 | 19.9 | 942.42 | 943.27 |
| 83.66493120119004 | -19.48 | 20.82 | 930.3 | 931.08 |
| 83.83227965786537 | -20.18 | 20.47 | 921.66 | 922.4 |
| 83.99962811454073 | -21.74 | 18.1 | 917.13 | 917.79 |
| 84.16697657121607 | -22.47 | 15.93 | 913.21 | 913.83 |
| 84.33432502789142 | -23.2 | 13.76 | 909.29 | 909.86 |
| 84.50167348456677 | -25.1 | 12.44 | 907.82 | 908.42 |
| 84.6690219412421 | -26.16 | 12.54 | 906.21 | 906.84 |
| 84.83637039791745 | -27.13 | 11.18 | 907.4 | 908.03 |
| 85.0037188545928 | -26.19 | 11.7 | 906.95 | 907.51 |
| 85.17106731126813 | -25.3 | 14.69 | 906.08 | 906.63 |
| 85.33841576794349 | -24.41 | 17.69 | 905.21 | 905.75 |
| 85.50576422461883 | -23.29 | 19 | 902.79 | 903.3 |
| 85.66381554481221 | -22.32 | 19.75 | 900.89 | 901.39 |
| 85.83116400148755 | -21.53 | 20.32 | 899.79 | 900.28 |
| 85.99851245816289 | -21.81 | 20.07 | 901.6 | 902.1 |
| 86.16586091483823 | -23.63 | 19.11 | 905.3 | 905.83 |
| 86.33320937151358 | -25.92 | 15.83 | 911.46 | 912 |
| 86.50055782818893 | -26.32 | 14.51 | 914.92 | 915.45 |
| 86.66790628486427 | -24.12 | 16.42 | 914.3 | 914.81 |
| 86.83525474153961 | -21.85 | 20.35 | 912.17 | 912.71 |
| 87.00260319821496 | -19.83 | 24.77 | 911.33 | 911.94 |
| 87.16995165489031 | -17.54 | 28.54 | 912.24 | 912.91 |
| 87.33730011156564 | -15.34 | 31.58 | 914.51 | 915.23 |
| 87.504648568241 | -13.04 | 33.11 | 919.67 | 920.42 |
| 87.67199702491634 | -12.56 | 33.17 | 925.62 | 926.35 |
| 87.83004834510972 | -11.6 | 35.53 | 925.48 | 926.31 |
| 87.99739680178506 | -10.56 | 38.02 | 930.4 | 931.33 |
| 88.1647452584604 | -10.24 | 39.44 | 937.21 | 938.2 |
| 88.33209371513574 | -10.27 | 40.73 | 944.58 | 945.61 |
| 88.49944217181108 | -9.41 | 42.58 | 952.53 | 953.62 |
| 88.66679062848644 | -9.16 | 43.53 | 961.44 | 962.55 |
| 88.83413908516178 | -9.84 | 43.01 | 971.95 | 973.02 |
| 89.00148754183712 | -7.71 | 43.33 | 984.61 | 985.65 |
| 89.16883599851246 | -6.8 | 42.16 | 1000.53 | 1001.5 |
| 89.33618445518782 | -5.52 | 42.02 | 1022.14 | 1023.08 |
| 89.50353291186315 | -6.22 | 41.17 | 1037.57 | 1038.48 |
| 89.6708813685385 | -7.51 | 39.28 | 1052.48 | 1053.35 |
| 89.83822982521386 | -9.58 | 34.6 | 1068.3 | 1069.09 |
| 90.00557828188919 | -11.65 | 29.91 | 1084.12 | 1084.84 |
| 90.16362960208257 | -12.28 | 27.81 | 1095.38 | 1096.08 |
| 90.3309780587579 | -11.99 | 27.33 | 1102.96 | 1103.67 |
| 90.49832651543326 | -12.05 | 26.16 | 1109.65 | 1110.32 |
| 90.66567497210859 | -11.69 | 25.02 | 1115.69 | 1116.32 |
| 90.83302342878395 | -11.18 | 25.04 | 1119.81 | 1120.42 |
| 91.00037188545929 | -10.19 | 25.62 | 1121.05 | 1121.65 |
| 91.16772034213463 | -8.43 | 27.37 | 1122.07 | 1122.7 |
| 91.33506879880998 | -7.34 | 27.76 | 1122.66 | 1123.29 |
| 91.50241725548533 | -7.54 | 26.74 | 1125.89 | 1126.48 |
| 91.66976571216065 | -6.32 | 28.3 | 1126.96 | 1127.55 |
| 91.83711416883601 | -3.92 | 32.38 | 1123.76 | 1124.41 |
| 92.00446262551137 | -1.94 | 36.83 | 1118.09 | 1118.86 |
| 92.1718110821867 | -1.13 | 39.38 | 1111.39 | 1112.25 |
| 92.33915953886203 | -1.08 | 40.57 | 1103.46 | 1104.37 |
| 92.49721085905541 | -0.31 | 43.17 | 1093.06 | 1094.04 |
| 92.66455931573077 | 0.86 | 46.33 | 1083.29 | 1084.39 |
| 92.83190777240611 | 3.3 | 49.08 | 1076.98 | 1078.2 |
| 92.99925622908145 | 5.74 | 51.82 | 1070.67 | 1072.01 |
| 93.1666046857568 | 6.6 | 54.09 | 1066.88 | 1068.37 |
| 93.33395314243214 | 6.75 | 54.23 | 1067.86 | 1069.37 |
| 93.50130159910749 | 6.59 | 53.66 | 1070.08 | 1071.57 |
| 93.66865005578283 | 5.06 | 51.23 | 1074.28 | 1075.64 |
| 93.83599851245818 | 2.58 | 47.71 | 1078.81 | 1080.03 |
| 94.00334696913353 | 1.69 | 46.63 | 1084.71 | 1085.9 |
| 94.17069542580886 | 0.38 | 45.59 | 1090.32 | 1091.49 |
| 94.3380438824842 | 0.39 | 45.57 | 1093.29 | 1094.44 |
| 94.50539233915954 | -0.06 | 44.8 | 1096.61 | 1097.73 |
| 94.66344365935292 | -0.67 | 44.27 | 1098.25 | 1099.34 |
| 94.83079211602828 | 0.76 | 47 | 1096.82 | 1098 |
| 94.99814057270362 | 1.37 | 49.11 | 1094.72 | 1096 |
| 95.16548902937897 | 0.44 | 48.41 | 1098.17 | 1099.4 |
| 95.33283748605432 | -1.84 | 45.02 | 1104.42 | 1105.49 |
| 95.50018594272963 | -4.22 | 41.58 | 1111.84 | 1112.76 |
| 95.66753439940499 | -6.75 | 37.46 | 1119.44 | 1120.22 |
| 95.83488285608034 | -9.33 | 33.21 | 1126.69 | 1127.33 |
| 96.00223131275567 | -10.54 | 30.95 | 1131.45 | 1132.03 |
| 96.16957976943102 | -11.38 | 28.89 | 1134.5 | 1135.02 |
| 96.33692822610638 | -12.06 | 27.26 | 1135.42 | 1135.91 |
| 96.50427668278171 | -12.55 | 26.23 | 1134.11 | 1134.58 |
| 96.67162513945706 | -12.59 | 25.48 | 1132.04 | 1132.51 |
| 96.8389735961324 | -13.28 | 24.65 | 1128.65 | 1129.13 |
| 96.99702491632577 | -14.78 | 22.55 | 1128.55 | 1129.04 |
| 97.16437337300111 | -15.6 | 21.32 | 1125.54 | 1126.06 |
| 97.33172182967647 | -14.72 | 22.32 | 1120.35 | 1120.88 |
| 97.49907028635181 | -14.9 | 21.48 | 1115.56 | 1116.13 |
| 97.66641874302715 | -13.33 | 23.47 | 1106.85 | 1107.4 |
| 97.8337671997025 | -11.17 | 26.78 | 1097.03 | 1097.56 |
| 98.00111565637785 | -9.84 | 27.84 | 1091.02 | 1091.54 |
| 98.16846411305319 | -10 | 26.82 | 1087.96 | 1088.46 |
| 98.33581256972855 | -11.55 | 23.23 | 1085.69 | 1086.2 |
| 98.50316102640389 | -12.02 | 22.81 | 1083.13 | 1083.64 |
| 98.67050948307921 | -12.38 | 22.61 | 1080.02 | 1080.53 |
| 98.83785793975456 | -13.15 | 21.08 | 1079.42 | 1079.92 |
| 99.0052063964299 | -14.64 | 18.01 | 1082.34 | 1082.8 |
| 99.17255485310525 | -16.5 | 15.66 | 1090.05 | 1090.48 |
| 99.33060617329863 | -17.32 | 15.23 | 1097.31 | 1097.72 |
| 99.49795462997399 | -17.35 | 16.61 | 1095.7 | 1096.12 |
| 99.66530308664933 | -16.6 | 17.32 | 1092.63 | 1093.02 |
| 99.83265154332467 | -15.84 | 18.03 | 1089.56 | 1089.92 |
| 100.0 | -15.86 | 18.52 | 1089.84 | 1090.21 |